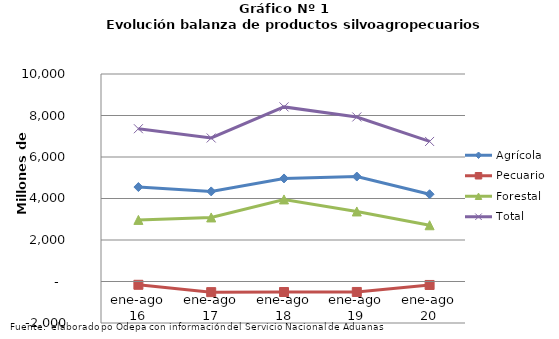
| Category | Agrícola | Pecuario | Forestal | Total |
|---|---|---|---|---|
| ene-ago 16 | 4552453 | -158227 | 2968510 | 7362736 |
| ene-ago 17 | 4341587 | -512611 | 3086758 | 6915734 |
| ene-ago 18 | 4966783 | -506522 | 3954164 | 8414425 |
| ene-ago 19 | 5058177 | -504222 | 3375439 | 7929394 |
| ene-ago 20 | 4206214 | -166933 | 2710661 | 6749942 |